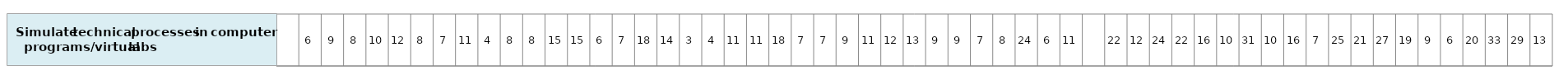
| Category | Simulate technical processes in computer programs/virtual labs |
|---|---|
| nan | 1 |
| 5.875839314065986 | 1 |
| 9.105985287039822 | 1 |
| 8.156549099151949 | 1 |
| 9.567830935394863 | 1 |
| 12.10337276141902 | 1 |
| 7.914894757191384 | 1 |
| 6.695515282161045 | 1 |
| 10.65974628002654 | 1 |
| 3.859103751266909 | 1 |
| 7.7120183648702 | 1 |
| 8.046996240399434 | 1 |
| 15.42331566169095 | 1 |
| 15.13981836335724 | 1 |
| 6.135694051443032 | 1 |
| 6.54862204565109 | 1 |
| 18.00512034364037 | 1 |
| 14.21373916268423 | 1 |
| 3.38748782751266 | 1 |
| 4.295800892245763 | 1 |
| 11.39165789338988 | 1 |
| 11.19184863768406 | 1 |
| 17.92898151733504 | 1 |
| 6.778961997593044 | 1 |
| 6.618895616407337 | 1 |
| 9.472004853336657 | 1 |
| 11.43800120772297 | 1 |
| 12.16275260854618 | 1 |
| 13.22567150014902 | 1 |
| 8.801449844516629 | 1 |
| 8.734069453147152 | 1 |
| 7.062100156976205 | 1 |
| 8.483718978404047 | 1 |
| 23.98564522088416 | 1 |
| 5.616460769952266 | 1 |
| 10.89013231739386 | 1 |
| nan | 1 |
| 21.60074995404209 | 1 |
| 12.1697513607477 | 1 |
| 24.48484282461821 | 1 |
| 21.59151350774413 | 1 |
| 15.70343610341371 | 1 |
| 9.71165276528962 | 1 |
| 30.83525251772424 | 1 |
| 9.688842924308672 | 1 |
| 15.50501624383321 | 1 |
| 7.479468175863807 | 1 |
| 25.29802061341066 | 1 |
| 20.98751462154561 | 1 |
| 26.71964230707805 | 1 |
| 18.59522478518883 | 1 |
| 9.055149878710315 | 1 |
| 5.704909142663879 | 1 |
| 20.39565033327184 | 1 |
| 32.74101092396096 | 1 |
| 29.18327463895903 | 1 |
| 12.63568198415735 | 1 |